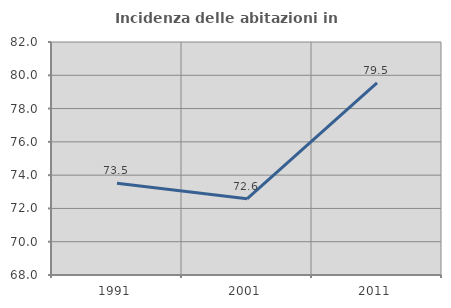
| Category | Incidenza delle abitazioni in proprietà  |
|---|---|
| 1991.0 | 73.517 |
| 2001.0 | 72.577 |
| 2011.0 | 79.548 |